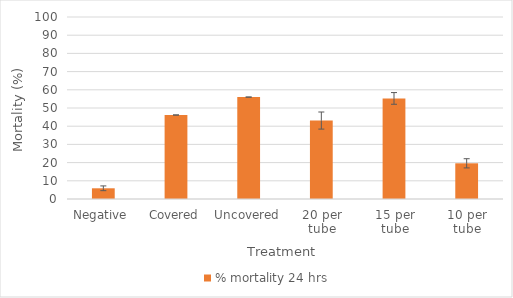
| Category | % mortality 24 hrs |
|---|---|
| Negative  | 5.882 |
| Covered | 46.154 |
| Uncovered | 56 |
| 20 per tube | 43.103 |
| 15 per tube | 55.263 |
| 10 per tube | 19.608 |